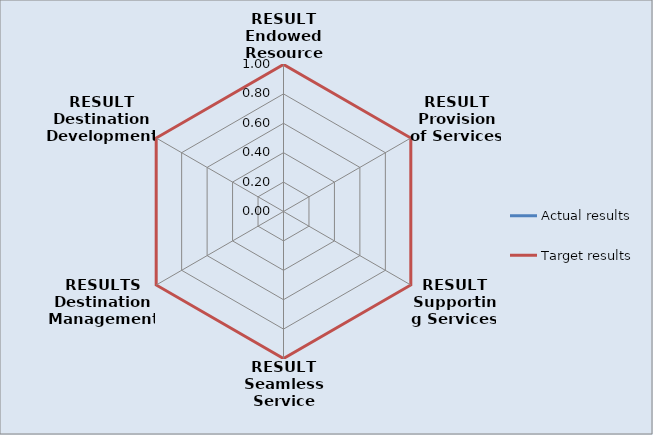
| Category | Actual results | Target results |
|---|---|---|
| RESULT Endowed Resources | 0 | 1 |
| RESULT Provision of Services  | 0 | 1 |
| RESULT Supporting Services  | 0 | 1 |
| RESULT Seamless Service Chain  | 0 | 1 |
| RESULTS Destination Management  | 0 | 1 |
| RESULT Destination Development  | 0 | 1 |